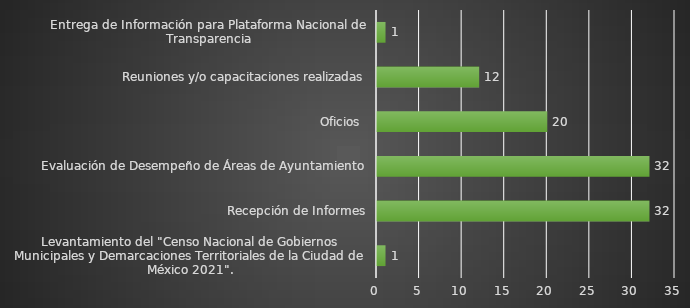
| Category | INDICADOR  |
|---|---|
| Levantamiento del "Censo Nacional de Gobiernos Municipales y Demarcaciones Territoriales de la Ciudad de México 2021". | 1 |
| Recepción de Informes | 32 |
| Evaluación de Desempeño de Áreas de Ayuntamiento | 32 |
| Oficios  | 20 |
| Reuniones y/o capacitaciones realizadas | 12 |
| Entrega de Información para Plataforma Nacional de Transparencia | 1 |